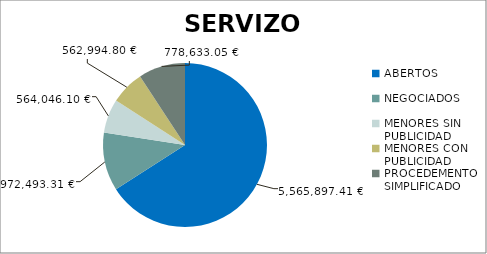
| Category | Series 0 |
|---|---|
| ABERTOS  | 5565897.41 |
| NEGOCIADOS  | 972493.31 |
| MENORES SIN PUBLICIDAD | 564046.1 |
| MENORES CON PUBLICIDAD | 562994.8 |
| PROCEDEMENTO SIMPLIFICADO | 778633.05 |